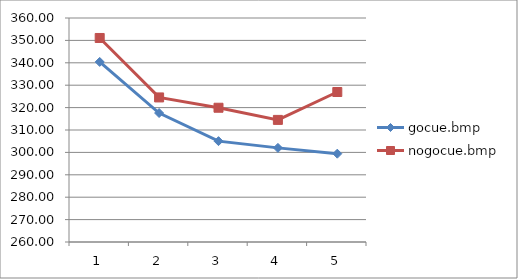
| Category | gocue.bmp | nogocue.bmp |
|---|---|---|
| 0 | 340.39 | 351.08 |
| 1 | 317.58 | 324.54 |
| 2 | 305.03 | 319.94 |
| 3 | 302.02 | 314.51 |
| 4 | 299.42 | 326.96 |